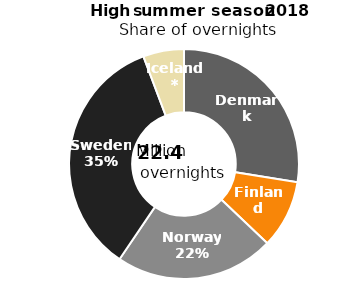
| Category | Summer 2018 |
|---|---|
| Denmark | 6167938 |
| Finland | 2141041 |
| Norway | 5009555 |
| Sweden | 7788138 |
| Iceland* | 1285544 |